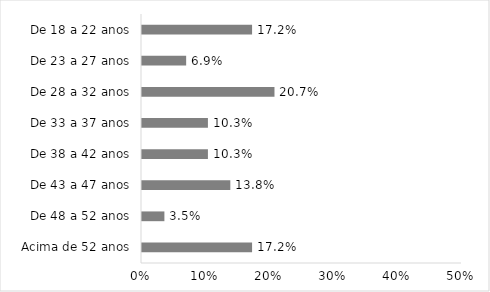
| Category | Series 0 |
|---|---|
| Acima de 52 anos | 0.172 |
| De 48 a 52 anos | 0.035 |
| De 43 a 47 anos | 0.138 |
| De 38 a 42 anos | 0.103 |
| De 33 a 37 anos | 0.103 |
| De 28 a 32 anos | 0.207 |
| De 23 a 27 anos | 0.069 |
| De 18 a 22 anos | 0.172 |